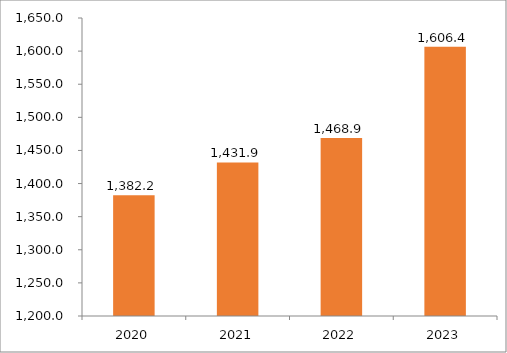
| Category | Series 1 |
|---|---|
| 2020.0 | 1382.197 |
| 2021.0 | 1431.908 |
| 2022.0 | 1468.941 |
| 2023.0 | 1606.414 |